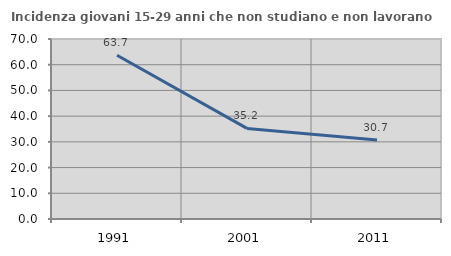
| Category | Incidenza giovani 15-29 anni che non studiano e non lavorano  |
|---|---|
| 1991.0 | 63.659 |
| 2001.0 | 35.224 |
| 2011.0 | 30.741 |